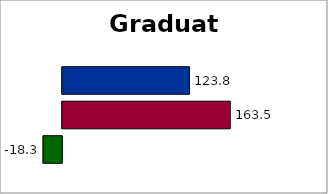
| Category | Series 2 | SREB states | 50 states and D.C. |
|---|---|---|---|
| 0 | -18.316 | 163.55 | 123.821 |